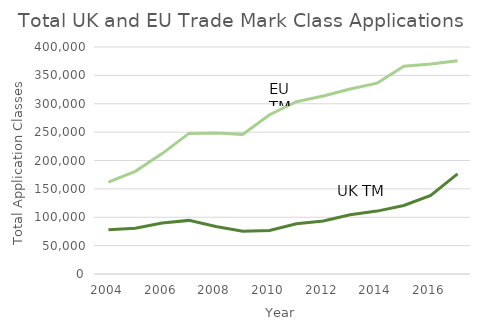
| Category | Series 0 | Series 1 |
|---|---|---|
| 2004.0 | 78104 | 161746 |
| 2005.0 | 80543 | 180914 |
| 2006.0 | 89676 | 212151 |
| 2007.0 | 94473 | 247765 |
| 2008.0 | 83685 | 248297 |
| 2009.0 | 75368 | 246064 |
| 2010.0 | 76856 | 280585 |
| 2011.0 | 88604 | 303689 |
| 2012.0 | 93361 | 313533 |
| 2013.0 | 104443 | 325961 |
| 2014.0 | 110838 | 336253 |
| 2015.0 | 120792 | 366206 |
| 2016.0 | 138409 | 369970 |
| 2017.0 | 176493 | 375734 |